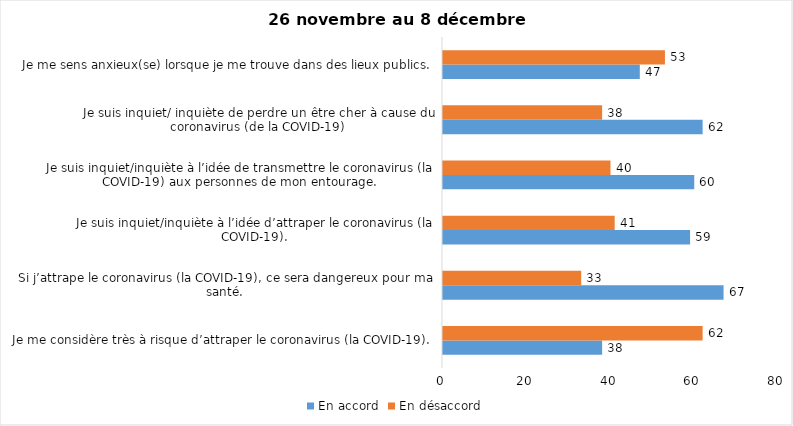
| Category | En accord | En désaccord |
|---|---|---|
| Je me considère très à risque d’attraper le coronavirus (la COVID-19). | 38 | 62 |
| Si j’attrape le coronavirus (la COVID-19), ce sera dangereux pour ma santé. | 67 | 33 |
| Je suis inquiet/inquiète à l’idée d’attraper le coronavirus (la COVID-19). | 59 | 41 |
| Je suis inquiet/inquiète à l’idée de transmettre le coronavirus (la COVID-19) aux personnes de mon entourage. | 60 | 40 |
| Je suis inquiet/ inquiète de perdre un être cher à cause du coronavirus (de la COVID-19) | 62 | 38 |
| Je me sens anxieux(se) lorsque je me trouve dans des lieux publics. | 47 | 53 |